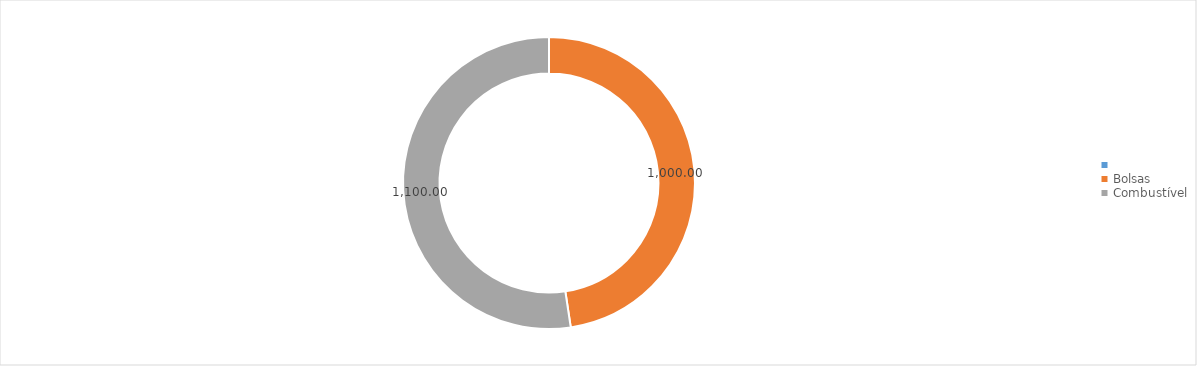
| Category | Total |
|---|---|
|  | 0 |
| Bolsas | 1000 |
| Combustível | 1100 |